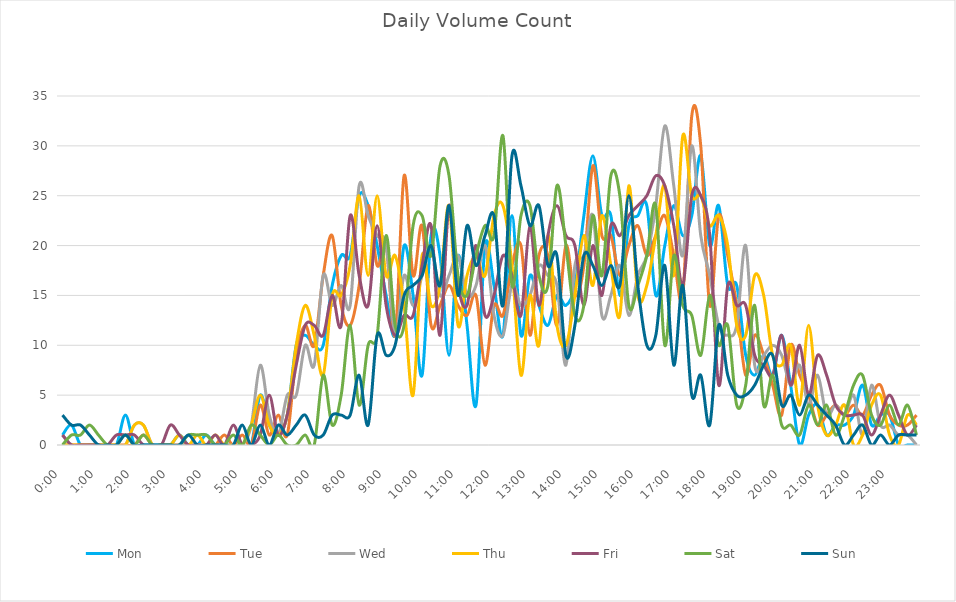
| Category | Mon | Tue | Wed | Thu | Fri | Sat | Sun |
|---|---|---|---|---|---|---|---|
| 0.0 | 1 | 0 | 1 | 0 | 1 | 0 | 3 |
| 0.010416666666666666 | 2 | 0 | 0 | 0 | 0 | 1 | 2 |
| 0.020833333333333332 | 0 | 0 | 0 | 0 | 0 | 1 | 2 |
| 0.03125 | 0 | 0 | 0 | 0 | 0 | 2 | 1 |
| 0.041666666666666664 | 0 | 0 | 0 | 0 | 0 | 1 | 0 |
| 0.05208333333333333 | 0 | 0 | 0 | 0 | 0 | 0 | 0 |
| 0.06249999999999999 | 0 | 0 | 0 | 0 | 1 | 0 | 0 |
| 0.07291666666666666 | 3 | 0 | 0 | 0 | 1 | 1 | 1 |
| 0.08333333333333333 | 0 | 0 | 2 | 2 | 1 | 0 | 0 |
| 0.09375 | 0 | 1 | 2 | 2 | 0 | 1 | 0 |
| 0.10416666666666667 | 0 | 0 | 0 | 0 | 0 | 0 | 0 |
| 0.11458333333333334 | 0 | 0 | 0 | 0 | 0 | 0 | 0 |
| 0.125 | 0 | 0 | 0 | 0 | 2 | 0 | 0 |
| 0.13541666666666666 | 1 | 0 | 0 | 1 | 1 | 0 | 0 |
| 0.14583333333333331 | 0 | 0 | 0 | 0 | 0 | 1 | 1 |
| 0.15624999999999997 | 0 | 0 | 0 | 1 | 0 | 1 | 0 |
| 0.16666666666666663 | 1 | 0 | 0 | 0 | 0 | 1 | 0 |
| 0.1770833333333333 | 0 | 0 | 0 | 1 | 1 | 0 | 0 |
| 0.18749999999999994 | 0 | 1 | 0 | 0 | 0 | 0 | 0 |
| 0.1979166666666666 | 0 | 0 | 0 | 0 | 2 | 1 | 0 |
| 0.20833333333333326 | 0 | 1 | 0 | 0 | 0 | 0 | 2 |
| 0.21874999999999992 | 0 | 0 | 2 | 2 | 0 | 2 | 0 |
| 0.22916666666666657 | 5 | 4 | 8 | 5 | 1 | 1 | 2 |
| 0.23958333333333323 | 2 | 1 | 3 | 2 | 5 | 0 | 0 |
| 0.2499999999999999 | 1 | 3 | 1 | 1 | 1 | 1 | 2 |
| 0.2604166666666666 | 3 | 1 | 5 | 3 | 3 | 0 | 1 |
| 0.27083333333333326 | 10 | 9 | 5 | 10 | 8 | 0 | 2 |
| 0.28124999999999994 | 11 | 12 | 10 | 14 | 12 | 1 | 3 |
| 0.29166666666666663 | 10 | 10 | 8 | 11 | 12 | 0 | 1 |
| 0.3020833333333333 | 10 | 17 | 17 | 7 | 11 | 7 | 1 |
| 0.3125 | 16 | 21 | 14 | 15 | 15 | 2 | 3 |
| 0.3229166666666667 | 19 | 14 | 16 | 15 | 12 | 5 | 3 |
| 0.33333333333333337 | 19 | 12 | 14 | 18 | 23 | 12 | 3 |
| 0.34375000000000006 | 25 | 16 | 26 | 25 | 17 | 4 | 7 |
| 0.35416666666666674 | 24 | 24 | 23 | 17 | 14 | 10 | 2 |
| 0.3645833333333334 | 20 | 18 | 21 | 25 | 22 | 11 | 11 |
| 0.3750000000000001 | 15 | 20 | 20 | 17 | 14 | 21 | 9 |
| 0.3854166666666668 | 11 | 11 | 11 | 19 | 11 | 12 | 10 |
| 0.3958333333333335 | 20 | 27 | 17 | 14 | 13 | 12 | 15 |
| 0.40625000000000017 | 15 | 17 | 14 | 5 | 13 | 22 | 16 |
| 0.41666666666666685 | 7 | 22 | 17 | 19 | 18 | 23 | 17 |
| 0.4270833333333333 | 21 | 12 | 20 | 14 | 22 | 19 | 20 |
| 0.4375000000000002 | 19 | 14 | 15 | 16 | 11 | 28 | 16 |
| 0.4479166666666669 | 9 | 16 | 17 | 24 | 24 | 27 | 24 |
| 0.4583333333333333 | 19 | 14 | 19 | 12 | 16 | 17 | 15 |
| 0.4687500000000003 | 12 | 13 | 15 | 17 | 14 | 15 | 22 |
| 0.47916666666666696 | 4 | 15 | 16 | 19 | 20 | 19 | 18 |
| 0.4895833333333333 | 20 | 8 | 20 | 17 | 13 | 22 | 21 |
| 0.5000000000000003 | 16 | 14 | 13 | 23 | 15 | 21 | 23 |
| 0.510416666666667 | 11 | 13 | 11 | 24 | 19 | 31 | 14 |
| 0.5208333333333334 | 23 | 18 | 16 | 18 | 17 | 16 | 29 |
| 0.5312500000000002 | 11 | 20 | 14 | 7 | 13 | 23 | 26 |
| 0.5416666666666669 | 17 | 11 | 15 | 15 | 22 | 24 | 22 |
| 0.5520833333333335 | 14 | 19 | 18 | 10 | 14 | 17 | 24 |
| 0.5625000000000001 | 12 | 19 | 17 | 21 | 21 | 16 | 18 |
| 0.5729166666666667 | 15 | 12 | 16 | 12 | 24 | 26 | 19 |
| 0.5833333333333334 | 14 | 20 | 8 | 10 | 21 | 20 | 9 |
| 0.59375 | 16 | 15 | 18 | 15 | 20 | 13 | 12 |
| 0.6041666666666666 | 23 | 18 | 19 | 21 | 14 | 14 | 19 |
| 0.6145833333333333 | 29 | 28 | 23 | 16 | 20 | 23 | 18 |
| 0.6249999999999999 | 23 | 21 | 13 | 23 | 15 | 17 | 16 |
| 0.6354166666666665 | 23 | 21 | 15 | 18 | 22 | 27 | 18 |
| 0.6458333333333331 | 15 | 17 | 18 | 13 | 21 | 25 | 16 |
| 0.6562499999999998 | 22 | 20 | 13 | 26 | 23 | 14 | 25 |
| 0.6666666666666666 | 23 | 22 | 17 | 15 | 24 | 16 | 16 |
| 0.677083333333333 | 24 | 19 | 19 | 16 | 25 | 19 | 10 |
| 0.6874999999999997 | 15 | 21 | 24 | 21 | 27 | 24 | 11 |
| 0.6979166666666666 | 20 | 23 | 32 | 26 | 26 | 10 | 18 |
| 0.7083333333333329 | 24 | 19 | 26 | 17 | 22 | 19 | 8 |
| 0.7187499999999996 | 21 | 15 | 19 | 31 | 16 | 14 | 16 |
| 0.7291666666666666 | 23 | 33 | 30 | 25 | 25 | 13 | 5 |
| 0.7395833333333328 | 29 | 30 | 21 | 25 | 25 | 9 | 7 |
| 0.75 | 20 | 14 | 17 | 22 | 21 | 15 | 2 |
| 0.7604166666666666 | 24 | 23 | 12 | 23 | 6 | 10 | 12 |
| 0.7708333333333327 | 16 | 19 | 11 | 20 | 16 | 12 | 7 |
| 0.78125 | 16 | 14 | 12 | 12 | 14 | 4 | 5 |
| 0.7916666666666666 | 9 | 7 | 20 | 11 | 14 | 6 | 5 |
| 0.8020833333333326 | 7 | 11 | 8 | 17 | 9 | 14 | 6 |
| 0.8125 | 9 | 9 | 9 | 15 | 8 | 4 | 8 |
| 0.8229166666666666 | 7 | 6 | 10 | 9 | 7 | 7 | 9 |
| 0.8333333333333334 | 11 | 3 | 9 | 8 | 11 | 2 | 4 |
| 0.84375 | 6 | 10 | 6 | 10 | 6 | 2 | 5 |
| 0.8541666666666666 | 0 | 7 | 8 | 4 | 10 | 1 | 3 |
| 0.8645833333333334 | 3 | 5 | 4 | 12 | 5 | 4 | 5 |
| 0.875 | 4 | 2 | 7 | 4 | 9 | 2 | 4 |
| 0.8854166666666666 | 1 | 3 | 3 | 1 | 7 | 4 | 3 |
| 0.8958333333333334 | 2 | 4 | 4 | 2 | 4 | 1 | 2 |
| 0.90625 | 2 | 3 | 3 | 4 | 3 | 3 | 0 |
| 0.9166666666666666 | 3 | 4 | 5 | 0 | 3 | 6 | 1 |
| 0.9270833333333334 | 6 | 3 | 1 | 1 | 3 | 7 | 2 |
| 0.9375 | 2 | 5 | 6 | 4 | 1 | 3 | 0 |
| 0.9479166666666666 | 3 | 6 | 2 | 5 | 3 | 2 | 1 |
| 0.9583333333333334 | 3 | 3 | 2 | 1 | 5 | 4 | 0 |
| 0.96875 | 0 | 2 | 1 | 0 | 3 | 2 | 1 |
| 0.9791666666666666 | 0 | 2 | 1 | 3 | 1 | 4 | 1 |
| 0.9895833333333334 | 0 | 3 | 0 | 2 | 2 | 1 | 1 |